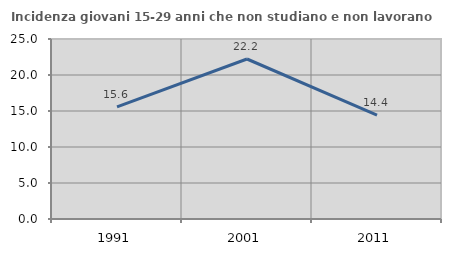
| Category | Incidenza giovani 15-29 anni che non studiano e non lavorano  |
|---|---|
| 1991.0 | 15.574 |
| 2001.0 | 22.222 |
| 2011.0 | 14.414 |